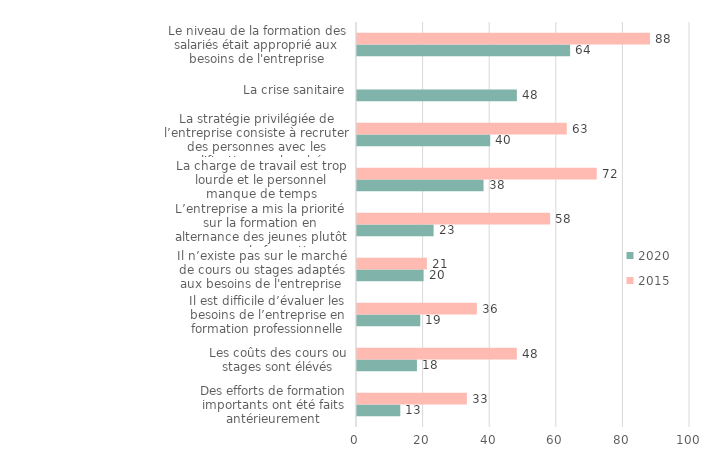
| Category | 2020 | 2015 |
|---|---|---|
| Des efforts de formation importants ont été faits antérieurement | 13 | 33 |
| Les coûts des cours ou stages sont élévés | 18 | 48 |
| Il est difficile d’évaluer les besoins de l’entreprise en formation professionnelle | 19 | 36 |
| Il n’existe pas sur le marché de cours ou stages adaptés aux besoins de l'entreprise | 20 | 21 |
| L’entreprise a mis la priorité sur la formation en alternance des jeunes plutôt que sur la formation professionnelle continue | 23 | 58 |
| La charge de travail est trop lourde et le personnel manque de temps | 38 | 72 |
| La stratégie privilégiée de l’entreprise consiste à recruter des personnes avec les qualifications recherchées | 40 | 63 |
| La crise sanitaire | 48 | 0 |
| Le niveau de la formation des salariés était approprié aux besoins de l'entreprise | 64 | 88 |